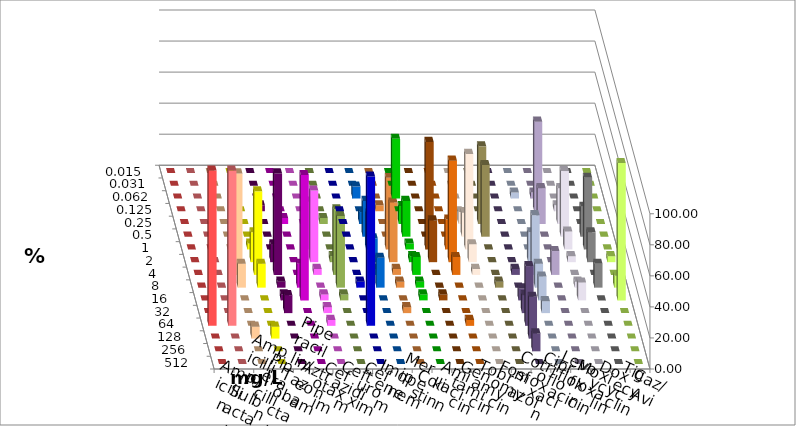
| Category | Ampicillin | Ampicillin/ Sulbactam | Piperacillin | Piperacillin/ Tazobactam | Aztreonam | Cefotaxim | Ceftazidim | Cefuroxim | Imipenem | Meropenem | Colistin | Amikacin | Gentamicin | Tobramycin | Fosfomycin | Cotrimoxazol | Ciprofloxacin | Levofloxacin | Moxifloxacin | Doxycyclin | Tigecyclin | Caz/Avi |
|---|---|---|---|---|---|---|---|---|---|---|---|---|---|---|---|---|---|---|---|---|---|---|
| 0.015 | 0 | 0 | 0 | 0 | 0 | 0 | 0 | 0 | 0 | 0 | 0 | 0 | 0 | 0 | 0 | 0 | 0 | 0 | 0 | 0 | 0 | 0 |
| 0.031 | 0 | 0 | 0 | 0 | 0 | 0 | 0 | 0 | 0 | 0 | 0 | 0 | 0 | 0 | 0 | 0 | 0 | 0 | 0 | 0 | 0 | 0 |
| 0.062 | 0 | 0 | 0 | 0 | 0 | 0 | 0 | 0 | 7.692 | 38.462 | 0 | 0 | 0 | 0 | 0 | 3.846 | 3.846 | 0 | 0 | 0 | 0 | 0 |
| 0.125 | 0 | 0 | 0 | 0 | 3.846 | 0 | 0 | 0 | 0 | 0 | 0 | 0 | 0 | 0 | 0 | 0 | 57.692 | 3.846 | 0 | 0 | 0 | 3.846 |
| 0.25 | 0 | 0 | 0 | 0 | 0 | 3.846 | 0 | 0 | 7.692 | 11.538 | 0 | 0 | 7.692 | 50 | 0 | 0 | 23.077 | 23.077 | 0 | 0 | 3.846 | 0 |
| 0.5 | 0 | 0 | 0 | 0 | 0 | 0 | 7.692 | 0 | 23.077 | 23.077 | 0 | 0 | 15.385 | 46.154 | 0 | 0 | 0 | 42.308 | 19.231 | 0 | 0 | 0 |
| 1.0 | 0 | 0 | 0 | 3.846 | 0 | 0 | 30.769 | 0 | 23.077 | 3.846 | 69.231 | 19.231 | 61.538 | 0 | 0 | 0 | 0 | 11.538 | 46.154 | 0 | 0 | 46.154 |
| 2.0 | 0 | 0 | 11.538 | 19.231 | 11.538 | 0 | 46.154 | 0 | 15.385 | 3.846 | 26.923 | 65.385 | 11.538 | 0 | 0 | 19.231 | 0 | 3.846 | 19.231 | 3.846 | 3.846 | 38.462 |
| 4.0 | 0 | 0 | 65.385 | 53.846 | 65.385 | 0 | 3.846 | 0 | 3.846 | 11.538 | 0 | 11.538 | 3.846 | 0 | 3.846 | 38.462 | 15.385 | 0 | 0 | 0 | 42.308 | 3.846 |
| 8.0 | 0 | 0 | 15.385 | 15.385 | 3.846 | 15.385 | 0 | 3.846 | 19.231 | 3.846 | 0 | 0 | 0 | 3.846 | 0 | 15.385 | 0 | 3.846 | 15.385 | 7.692 | 46.154 | 3.846 |
| 16.0 | 0 | 0 | 0 | 0 | 3.846 | 80.769 | 3.846 | 0 | 0 | 3.846 | 3.846 | 0 | 0 | 0 | 7.692 | 15.385 | 0 | 11.538 | 0 | 88.462 | 3.846 | 0 |
| 32.0 | 0 | 0 | 0 | 0 | 11.538 | 0 | 3.846 | 0 | 0 | 0 | 0 | 0 | 0 | 0 | 11.538 | 7.692 | 0 | 0 | 0 | 0 | 0 | 3.846 |
| 64.0 | 100 | 100 | 0 | 0 | 0 | 0 | 3.846 | 96.154 | 0 | 0 | 0 | 3.846 | 0 | 0 | 38.462 | 0 | 0 | 0 | 0 | 0 | 0 | 0 |
| 128.0 | 0 | 0 | 7.692 | 7.692 | 0 | 0 | 0 | 0 | 0 | 0 | 0 | 0 | 0 | 0 | 26.923 | 0 | 0 | 0 | 0 | 0 | 0 | 0 |
| 256.0 | 0 | 0 | 0 | 0 | 0 | 0 | 0 | 0 | 0 | 0 | 0 | 0 | 0 | 0 | 11.538 | 0 | 0 | 0 | 0 | 0 | 0 | 0 |
| 512.0 | 0 | 0 | 0 | 0 | 0 | 0 | 0 | 0 | 0 | 0 | 0 | 0 | 0 | 0 | 0 | 0 | 0 | 0 | 0 | 0 | 0 | 0 |